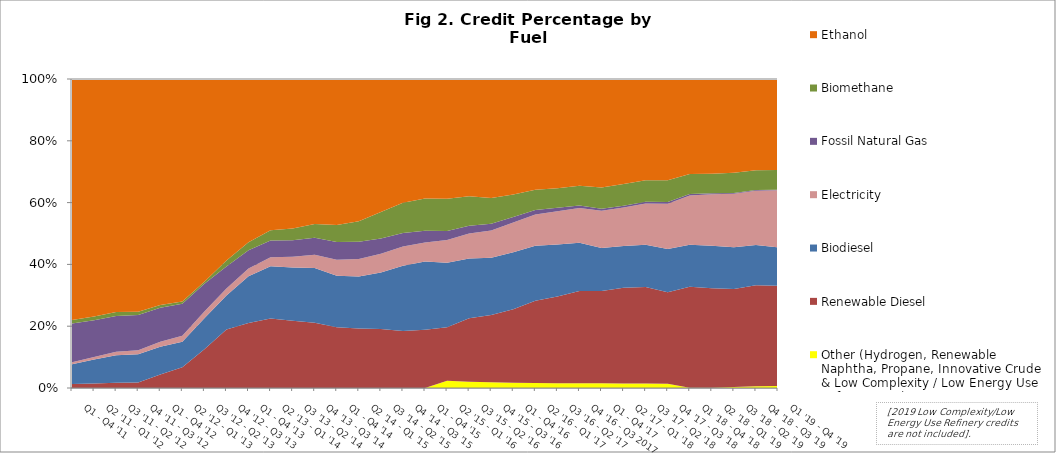
| Category | Other (Hydrogen, Renewable Naphtha, Propane, Innovative Crude & Low Complexity / Low Energy Use Refining, etc.) | Renewable Diesel | Biodiesel | Electricity | Fossil Natural Gas | Biomethane | Ethanol |
|---|---|---|---|---|---|---|---|
| Q1 - Q4 '11 | 0 | 4255 | 21066.75 | 1935.75 | 41097.5 | 3678.75 | 255888.25 |
| Q2 '11 - Q1 '12 | 0 | 5162.75 | 26837.25 | 2950.75 | 41170.5 | 4217.5 | 266727.25 |
| Q3 '11 - Q2 '12 | 0 | 6021.75 | 31928.25 | 4017.5 | 41417.75 | 4505.5 | 269743.5 |
| Q4 '11 - Q3 '12 | 0 | 6915.75 | 34835.25 | 5227.25 | 43542.5 | 4159.75 | 288811 |
| Q1 - Q4 '12 | 0 | 18164.75 | 37336.75 | 6746 | 45792.5 | 3711.25 | 304773.5 |
| Q2 '12 - Q1 '13 | 0 | 32600.75 | 40337.75 | 9379 | 50547.5 | 3679.5 | 351042.25 |
| Q3 '12 - Q2 '13 | 0 | 75473 | 60626 | 12868 | 54269.25 | 3920 | 394796.75 |
| Q4 '12 - Q3 '13 | 0 | 145738 | 84731.75 | 17304.25 | 54483.5 | 15309 | 451907.5 |
| Q1 - Q4 '13 | 0 | 197482.25 | 141667.5 | 23488.25 | 55463.75 | 24529.5 | 495969.5 |
| Q2 '13 - Q1 '14 | 0 | 229472.75 | 172125.5 | 30163.75 | 55062.5 | 33904.25 | 499193 |
| Q3 '13 - Q2 '14 | 0 | 237650.5 | 187184.5 | 38057.75 | 58140 | 42082 | 527117.75 |
| Q4 '13 - Q3 '14 | 0 | 230531.5 | 193299.25 | 46639.5 | 60638.5 | 47945.25 | 512500.5 |
| Q1 - Q4 '14 | 0 | 211244.75 | 179500 | 55332.5 | 61754 | 59889.5 | 507720.75 |
| Q2 '14 - Q1 '15 | 0 | 214231 | 186099.25 | 63321.25 | 62283.5 | 73451.75 | 511213.5 |
| Q3 '14 - Q2 '15 | 0 | 221521.75 | 212265.5 | 70066.25 | 57394.25 | 99920 | 499516 |
| Q4 '14 - Q3 '15 | 12.5 | 231039 | 264657.25 | 77983.75 | 54630.5 | 123086 | 502037.5 |
| Q1 - Q4 '15 | 18.5 | 259542.75 | 303477.5 | 84435 | 51526.5 | 143903.25 | 531188.5 |
| Q2 '15 - Q1 '16 | 37968.75 | 277096.75 | 335225.5 | 117624 | 47534 | 166579.25 | 622043.5 |
| Q3 '15 - Q2 '16 | 38112.25 | 384694.75 | 361311.75 | 152143.25 | 46525.5 | 178521.5 | 710200 |
| Q4 '15 - Q3 '16 | 39251.167 | 454443.5 | 387917 | 185794.25 | 44372.25 | 175672.25 | 805507.75 |
| Q1 - Q4 '16 | 39246.25 | 560304.25 | 434195.75 | 226175.75 | 42687.5 | 170422.25 | 879846.5 |
| Q2 '16 - Q1 '17 | 38815.333 | 644325.25 | 430204 | 244170.25 | 35748 | 157929.5 | 866449 |
| Q3 '16 - Q2 '17 | 38495.25 | 685591.75 | 412601.75 | 263683.25 | 27637.75 | 153419.75 | 866394.5 |
| Q4 '16 - Q3 2017 | 37963.75 | 752235 | 393268 | 282887.5 | 20857.75 | 161286.75 | 869357.25 |
| Q1 - Q4 '17 | 37501.5 | 741682.5 | 345519.5 | 299528.5 | 14623.5 | 170246.25 | 872056 |
| Q2 '17 - Q1 '18 | 37136.75 | 794697.25 | 345443.75 | 320878.25 | 14438.75 | 180942.75 | 870380.25 |
| Q3 '17 - Q2 '18 | 36755 | 811822.25 | 354343.5 | 346255 | 15099 | 180192.25 | 850128.25 |
| Q4 '17 - Q3 '18 | 36385.75 | 771975.75 | 366448.5 | 381588.25 | 15325 | 183354.75 | 854713.25 |
| Q1 '18 - Q4 '18 | 2920.55 | 936189.4 | 390857.2 | 456227 | 13381.6 | 186642.6 | 881120 |
| Q2 '18 - Q1 '19 | 3718.25 | 1026714.5 | 440743.667 | 531520.417 | 11149.167 | 200784.5 | 980778.333 |
| Q3 '18 - Q2 '19 | 9839.167 | 1089847 | 462522.833 | 592117.917 | 9553.667 | 223016.167 | 1041412.333 |
| Q4 '18 - Q3 '19 | 21527.4 | 1170861.8 | 466626 | 631726.1 | 8482.6 | 228025.2 | 1059706.6 |
| Q1 '19 - Q4 '19 | 23492.083 | 1195131.75 | 457959 | 680179.25 | 7700.75 | 234202.75 | 1085442 |